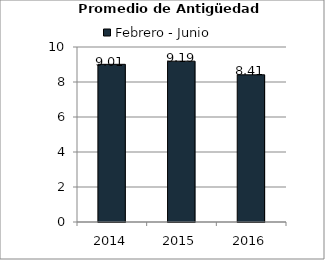
| Category | Febrero - Junio |
|---|---|
| 2014.0 | 9.01 |
| 2015.0 | 9.19 |
| 2016.0 | 8.41 |